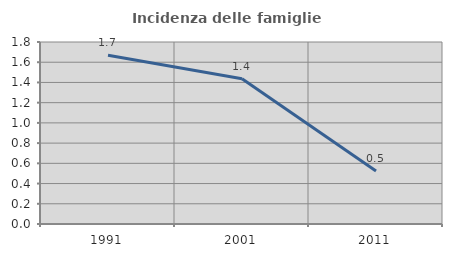
| Category | Incidenza delle famiglie numerose |
|---|---|
| 1991.0 | 1.669 |
| 2001.0 | 1.436 |
| 2011.0 | 0.523 |